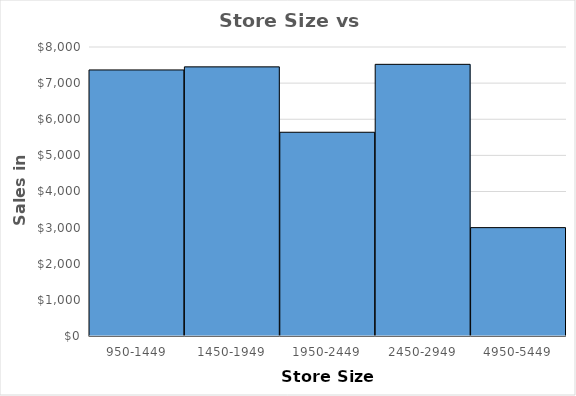
| Category | Total |
|---|---|
| 950-1449 | 7365 |
| 1450-1949 | 7450 |
| 1950-2449 | 5640 |
| 2450-2949 | 7520 |
| 4950-5449 | 3000 |